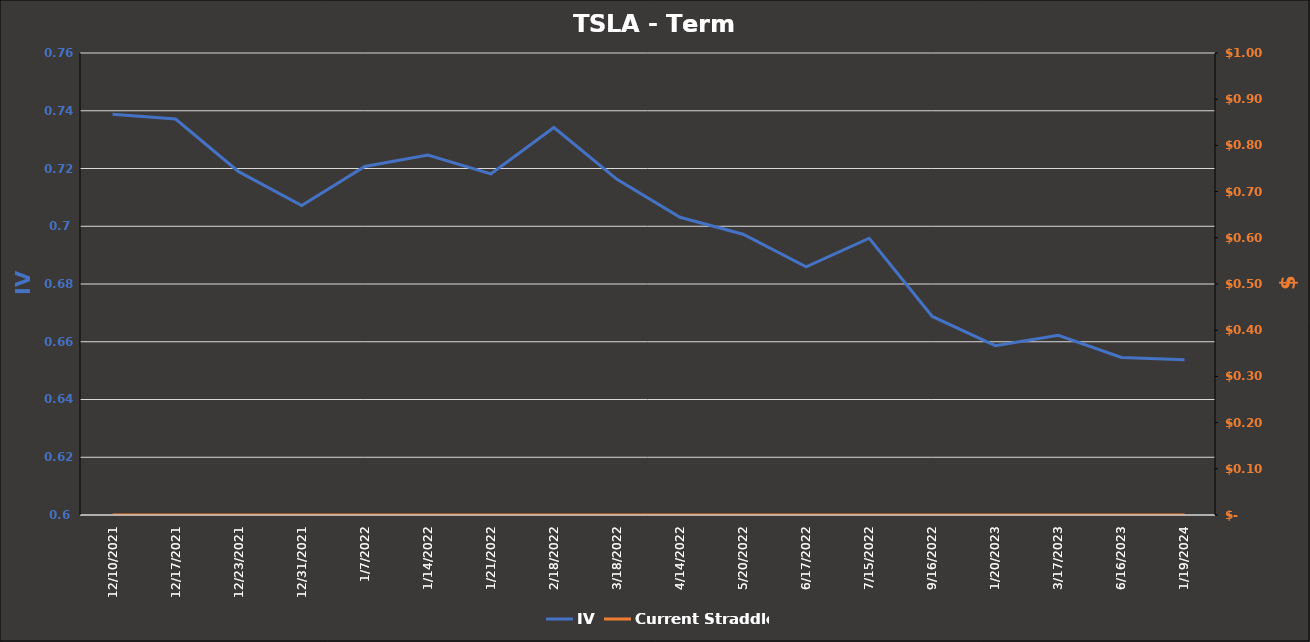
| Category | IV |
|---|---|
| 12/10/21 | 0.739 |
| 12/17/21 | 0.737 |
| 12/23/21 | 0.719 |
| 12/31/21 | 0.707 |
| 1/7/22 | 0.721 |
| 1/14/22 | 0.725 |
| 1/21/22 | 0.718 |
| 2/18/22 | 0.734 |
| 3/18/22 | 0.716 |
| 4/14/22 | 0.703 |
| 5/20/22 | 0.697 |
| 6/17/22 | 0.686 |
| 7/15/22 | 0.696 |
| 9/16/22 | 0.669 |
| 1/20/23 | 0.659 |
| 3/17/23 | 0.662 |
| 6/16/23 | 0.655 |
| 1/19/24 | 0.654 |